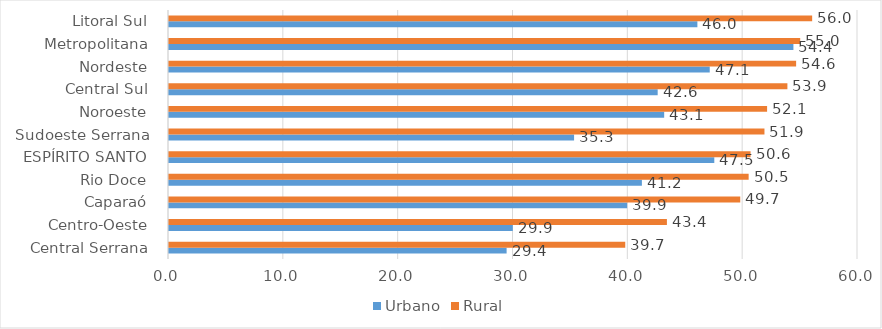
| Category | Urbano | Rural |
|---|---|---|
|  Central Serrana  | 29.4 | 39.732 |
|  Centro-Oeste  | 29.939 | 43.36 |
|  Caparaó  | 39.895 | 49.746 |
|  Rio Doce  | 41.181 | 50.477 |
|  ESPÍRITO SANTO  | 47.486 | 50.643 |
|  Sudoeste Serrana  | 35.275 | 51.855 |
|  Noroeste  | 43.121 | 52.083 |
|  Central Sul  | 42.555 | 53.852 |
|  Nordeste  | 47.089 | 54.611 |
|  Metropolitana  | 54.376 | 54.966 |
|  Litoral Sul  | 46.013 | 56.009 |